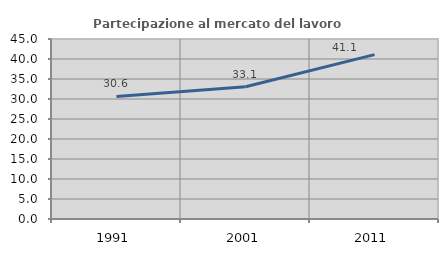
| Category | Partecipazione al mercato del lavoro  femminile |
|---|---|
| 1991.0 | 30.627 |
| 2001.0 | 33.079 |
| 2011.0 | 41.092 |